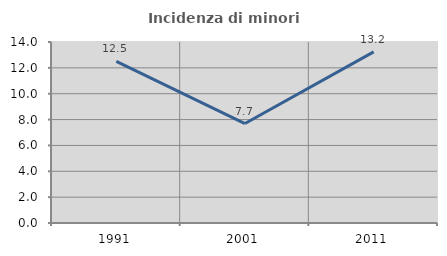
| Category | Incidenza di minori stranieri |
|---|---|
| 1991.0 | 12.5 |
| 2001.0 | 7.692 |
| 2011.0 | 13.235 |